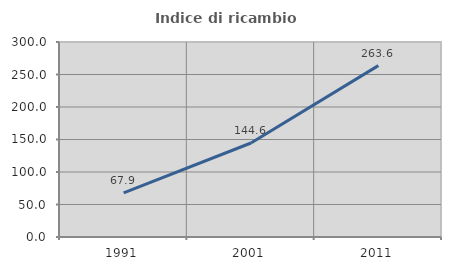
| Category | Indice di ricambio occupazionale  |
|---|---|
| 1991.0 | 67.879 |
| 2001.0 | 144.643 |
| 2011.0 | 263.636 |